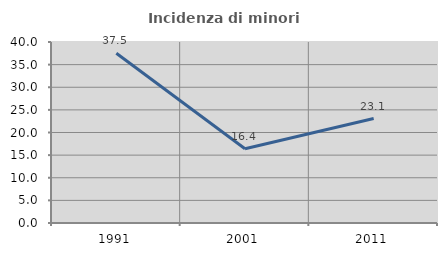
| Category | Incidenza di minori stranieri |
|---|---|
| 1991.0 | 37.5 |
| 2001.0 | 16.393 |
| 2011.0 | 23.077 |